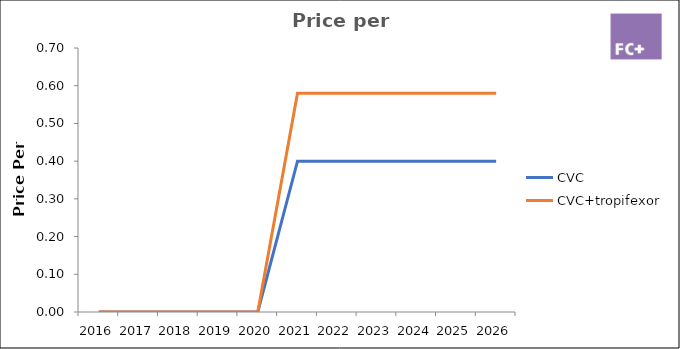
| Category | CVC | CVC+tropifexor |
|---|---|---|
| 2016.0 | 0 | 0 |
| 2017.0 | 0 | 0 |
| 2018.0 | 0 | 0 |
| 2019.0 | 0 | 0 |
| 2020.0 | 0 | 0 |
| 2021.0 | 0.4 | 0.58 |
| 2022.0 | 0.4 | 0.58 |
| 2023.0 | 0.4 | 0.58 |
| 2024.0 | 0.4 | 0.58 |
| 2025.0 | 0.4 | 0.58 |
| 2026.0 | 0.4 | 0.58 |